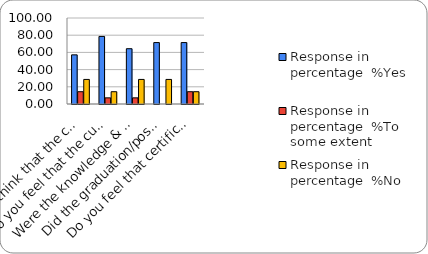
| Category | Response in percentage  |
|---|---|
| Do you think that the curriculum which you had during your graduation/post graduation has provided you with the knowledge & skills necessary to get employed/Self-employed or start own business? | 28.571 |
| Do you feel that the curriculum you studied is helpful in progression to higher studies? | 14.286 |
| Were the knowledge & skills acquired through the curriculum useful to you while working on the job?   | 28.571 |
| Did the graduation/post-graduation programme bring about any attitudinal and behavioural change in you? | 28.571 |
| Do you feel that certificate/ diploma courses offered by the college in addition to the curriculum lead to better career prospects? | 14.286 |